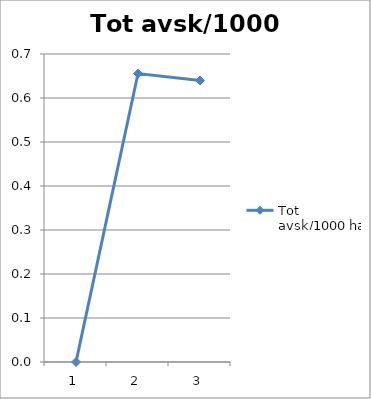
| Category | Tot avsk/1000 ha |
|---|---|
| 0 | 0 |
| 1 | 0.656 |
| 2 | 0.64 |